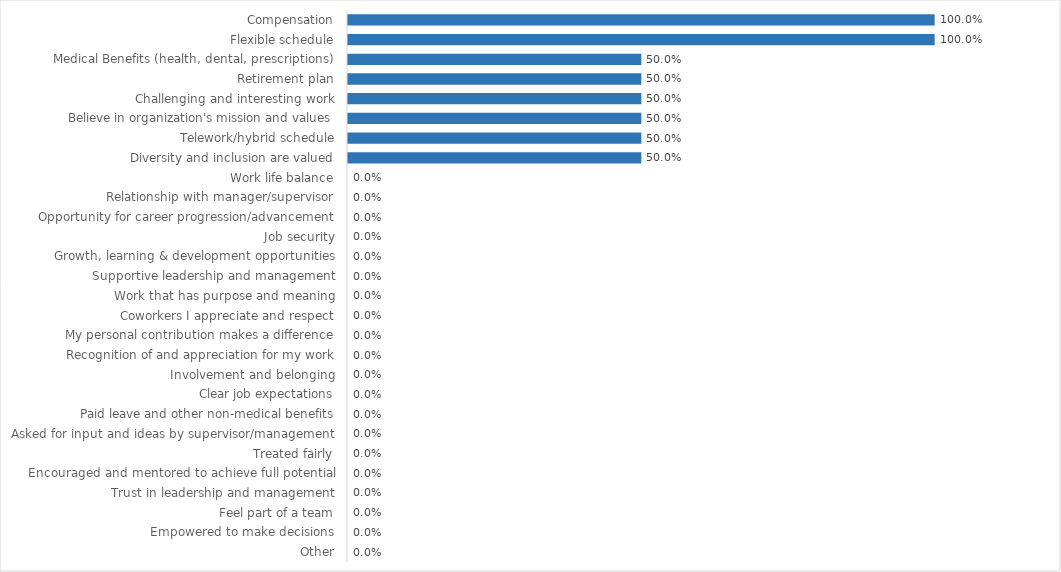
| Category | Human Rights Commission |
|---|---|
| Compensation | 1 |
| Flexible schedule | 1 |
| Medical Benefits (health, dental, prescriptions) | 0.5 |
| Retirement plan | 0.5 |
| Challenging and interesting work | 0.5 |
| Believe in organization's mission and values | 0.5 |
| Telework/hybrid schedule | 0.5 |
| Diversity and inclusion are valued | 0.5 |
| Work life balance | 0 |
| Relationship with manager/supervisor | 0 |
| Opportunity for career progression/advancement | 0 |
| Job security | 0 |
| Growth, learning & development opportunities | 0 |
| Supportive leadership and management | 0 |
| Work that has purpose and meaning | 0 |
| Coworkers I appreciate and respect | 0 |
| My personal contribution makes a difference | 0 |
| Recognition of and appreciation for my work | 0 |
| Involvement and belonging | 0 |
| Clear job expectations | 0 |
| Paid leave and other non-medical benefits | 0 |
| Asked for input and ideas by supervisor/management | 0 |
| Treated fairly | 0 |
| Encouraged and mentored to achieve full potential | 0 |
| Trust in leadership and management | 0 |
| Feel part of a team | 0 |
| Empowered to make decisions | 0 |
| Other | 0 |